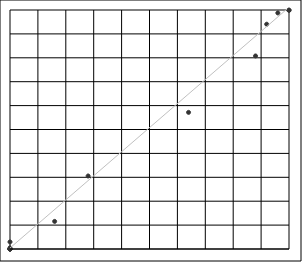
| Category | Series 0 |
|---|---|
| 0.0 | 0 |
| 0.0 | 0 |
| 0.0 | 0 |
| 0.0 | 0 |
| 0.0 | 0.004 |
| 0.0 | 0.055 |
| 0.0 | 0.5 |
| 0.0 | 2.959 |
| 16.0 | 11.551 |
| 28.0 | 30.552 |
| 64.0 | 57.164 |
| 88.0 | 80.776 |
| 92.0 | 94.048 |
| 96.0 | 98.771 |
| 100.0 | 99.834 |
| 100.0 | 99.986 |